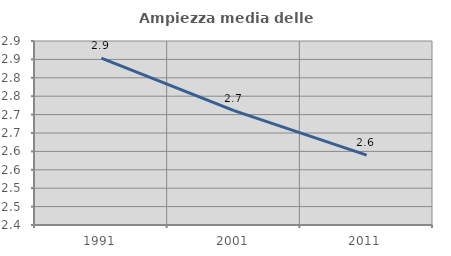
| Category | Ampiezza media delle famiglie |
|---|---|
| 1991.0 | 2.853 |
| 2001.0 | 2.711 |
| 2011.0 | 2.59 |